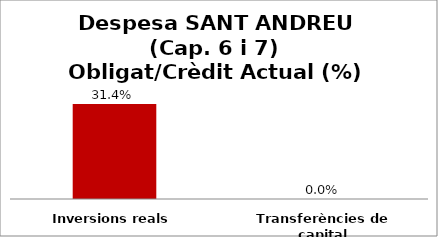
| Category | Series 0 |
|---|---|
| Inversions reals | 0.314 |
| Transferències de capital | 0 |